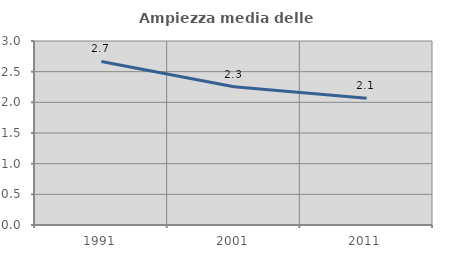
| Category | Ampiezza media delle famiglie |
|---|---|
| 1991.0 | 2.667 |
| 2001.0 | 2.253 |
| 2011.0 | 2.066 |